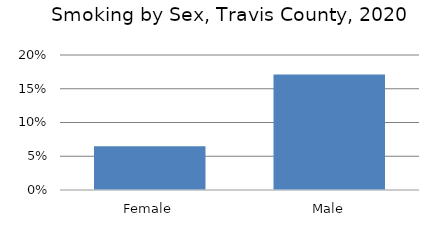
| Category | Series 0 |
|---|---|
| Female | 0.065 |
| Male | 0.171 |